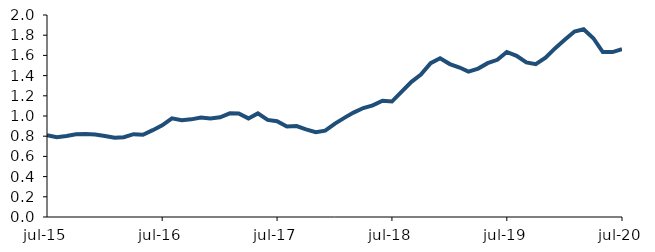
| Category | Series 0 |
|---|---|
| 2015-07-01 | 0.811 |
| 2015-08-01 | 0.789 |
| 2015-09-01 | 0.802 |
| 2015-10-01 | 0.82 |
| 2015-11-01 | 0.821 |
| 2015-12-01 | 0.818 |
| 2016-01-01 | 0.803 |
| 2016-02-01 | 0.785 |
| 2016-03-01 | 0.79 |
| 2016-04-01 | 0.82 |
| 2016-05-01 | 0.815 |
| 2016-06-01 | 0.86 |
| 2016-07-01 | 0.907 |
| 2016-08-01 | 0.978 |
| 2016-09-01 | 0.958 |
| 2016-10-01 | 0.967 |
| 2016-11-01 | 0.986 |
| 2016-12-01 | 0.976 |
| 2017-01-01 | 0.988 |
| 2017-02-01 | 1.026 |
| 2017-03-01 | 1.025 |
| 2017-04-01 | 0.976 |
| 2017-05-01 | 1.026 |
| 2017-06-01 | 0.961 |
| 2017-07-01 | 0.948 |
| 2017-08-01 | 0.895 |
| 2017-09-01 | 0.9 |
| 2017-10-01 | 0.868 |
| 2017-11-01 | 0.84 |
| 2017-12-01 | 0.855 |
| 2018-01-01 | 0.925 |
| 2018-02-01 | 0.984 |
| 2018-03-01 | 1.034 |
| 2018-04-01 | 1.079 |
| 2018-05-01 | 1.105 |
| 2018-06-01 | 1.151 |
| 2018-07-01 | 1.143 |
| 2018-08-01 | 1.242 |
| 2018-09-01 | 1.338 |
| 2018-10-01 | 1.41 |
| 2018-11-01 | 1.523 |
| 2018-12-01 | 1.572 |
| 2019-01-01 | 1.514 |
| 2019-02-01 | 1.48 |
| 2019-03-01 | 1.44 |
| 2019-04-01 | 1.47 |
| 2019-05-01 | 1.523 |
| 2019-06-01 | 1.556 |
| 2019-07-01 | 1.634 |
| 2019-08-01 | 1.596 |
| 2019-09-01 | 1.53 |
| 2019-10-01 | 1.513 |
| 2019-11-01 | 1.577 |
| 2019-12-01 | 1.669 |
| 2020-01-01 | 1.754 |
| 2020-02-01 | 1.837 |
| 2020-03-01 | 1.859 |
| 2020-04-01 | 1.77 |
| 2020-05-01 | 1.633 |
| 2020-06-01 | 1.632 |
| 2020-07-01 | 1.662 |